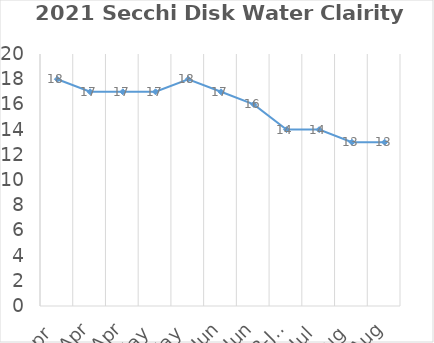
| Category | Series 0 |
|---|---|
| 2021-04-01 | 18 |
| 2021-04-16 | 17 |
| 2021-04-30 | 17 |
| 2019-05-14 | 17 |
| 2019-05-28 | 18 |
| 2019-06-11 | 17 |
| 2019-06-24 | 16 |
| 2019-07-08 | 14 |
| 2019-07-23 | 14 |
| 2019-08-06 | 13 |
| 2019-08-17 | 13 |